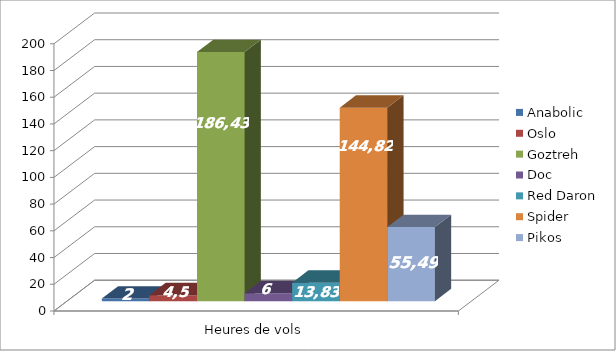
| Category | Anabolic | Oslo | Goztreh | Doc | Red Daron | Spider | Pikos |
|---|---|---|---|---|---|---|---|
| 0 | 2 | 4.5 | 186.43 | 6 | 13.83 | 144.82 | 55.49 |